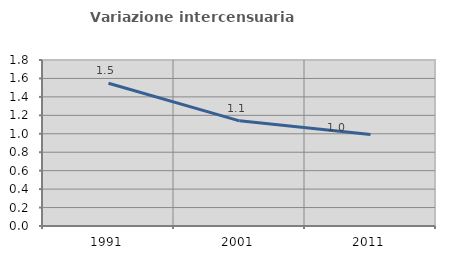
| Category | Variazione intercensuaria annua |
|---|---|
| 1991.0 | 1.548 |
| 2001.0 | 1.14 |
| 2011.0 | 0.993 |